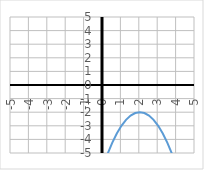
| Category | y |
|---|---|
| -5.0 | -51 |
| -4.75 | -47.562 |
| -4.5 | -44.25 |
| -4.25 | -41.062 |
| -4.0 | -38 |
| -3.75 | -35.062 |
| -3.5 | -32.25 |
| -3.25 | -29.562 |
| -3.0 | -27 |
| -2.75 | -24.562 |
| -2.5 | -22.25 |
| -2.25 | -20.062 |
| -2.0 | -18 |
| -1.75 | -16.062 |
| -1.5 | -14.25 |
| -1.25 | -12.562 |
| -1.0 | -11 |
| -0.75 | -9.562 |
| -0.5 | -8.25 |
| -0.25 | -7.062 |
| 0.0 | -6 |
| 0.25 | -5.062 |
| 0.5 | -4.25 |
| 0.75 | -3.562 |
| 1.0 | -3 |
| 1.25 | -2.562 |
| 1.5 | -2.25 |
| 1.75 | -2.062 |
| 2.0 | -2 |
| 2.25 | -2.062 |
| 2.5 | -2.25 |
| 2.75 | -2.562 |
| 3.0 | -3 |
| 3.25 | -3.562 |
| 3.5 | -4.25 |
| 3.75 | -5.062 |
| 4.0 | -6 |
| 4.25 | -7.062 |
| 4.5 | -8.25 |
| 4.75 | -9.562 |
| 5.0 | -11 |